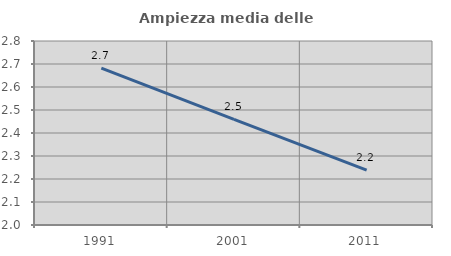
| Category | Ampiezza media delle famiglie |
|---|---|
| 1991.0 | 2.682 |
| 2001.0 | 2.459 |
| 2011.0 | 2.239 |